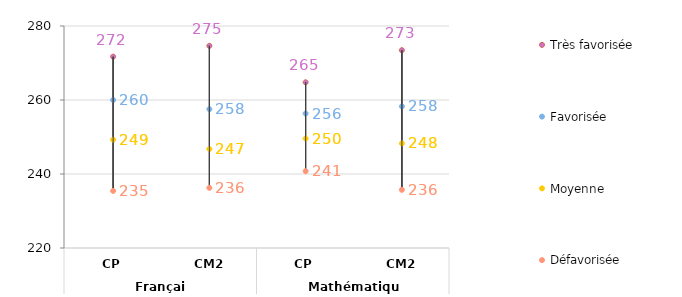
| Category | Très favorisée | Favorisée | Moyenne | Défavorisée |
|---|---|---|---|---|
| 0 | 271.71 | 260 | 249.27 | 235.43 |
| 1 | 274.64 | 257.51 | 246.75 | 236.27 |
| 2 | 264.78 | 256.34 | 249.58 | 240.76 |
| 3 | 273.46 | 258.27 | 248.29 | 235.72 |